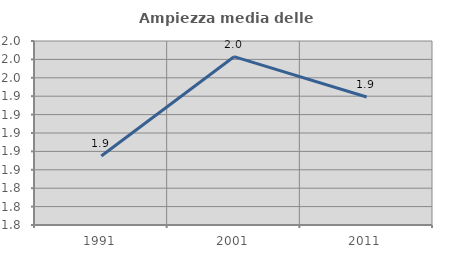
| Category | Ampiezza media delle famiglie |
|---|---|
| 1991.0 | 1.875 |
| 2001.0 | 1.983 |
| 2011.0 | 1.939 |